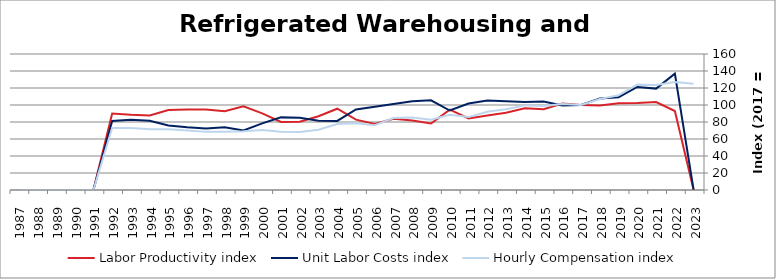
| Category | Labor Productivity index | Unit Labor Costs index | Hourly Compensation index |
|---|---|---|---|
| 2023.0 | 0 | 0 | 125.055 |
| 2022.0 | 92.901 | 136.881 | 127.164 |
| 2021.0 | 103.544 | 119.295 | 123.523 |
| 2020.0 | 102.479 | 121.245 | 124.251 |
| 2019.0 | 102.044 | 109.217 | 111.449 |
| 2018.0 | 99.293 | 107.762 | 107 |
| 2017.0 | 100 | 100 | 100 |
| 2016.0 | 101.795 | 99.392 | 101.176 |
| 2015.0 | 95.026 | 104.096 | 98.918 |
| 2014.0 | 96.062 | 103.625 | 99.544 |
| 2013.0 | 90.887 | 104.514 | 94.99 |
| 2012.0 | 87.558 | 105.161 | 92.077 |
| 2011.0 | 84.261 | 101.802 | 85.779 |
| 2010.0 | 94.575 | 93.498 | 88.425 |
| 2009.0 | 78.294 | 105.573 | 82.657 |
| 2008.0 | 81.719 | 104.409 | 85.322 |
| 2007.0 | 83.718 | 101.158 | 84.688 |
| 2006.0 | 77.817 | 97.882 | 76.169 |
| 2005.0 | 82.734 | 94.8 | 78.432 |
| 2004.0 | 95.615 | 81.278 | 77.714 |
| 2003.0 | 86.83 | 81.612 | 70.863 |
| 2002.0 | 80.417 | 84.999 | 68.353 |
| 2001.0 | 80.141 | 85.439 | 68.472 |
| 2000.0 | 90.136 | 78.327 | 70.601 |
| 1999.0 | 98.493 | 70.129 | 69.072 |
| 1998.0 | 92.753 | 73.866 | 68.513 |
| 1997.0 | 94.732 | 72.22 | 68.415 |
| 1996.0 | 94.769 | 73.805 | 69.944 |
| 1995.0 | 94.147 | 75.936 | 71.492 |
| 1994.0 | 87.777 | 81.45 | 71.494 |
| 1993.0 | 88.476 | 82.507 | 72.999 |
| 1992.0 | 89.869 | 81.109 | 72.892 |
| 1991.0 | 0 | 0 | 0 |
| 1990.0 | 0 | 0 | 0 |
| 1989.0 | 0 | 0 | 0 |
| 1988.0 | 0 | 0 | 0 |
| 1987.0 | 0 | 0 | 0 |